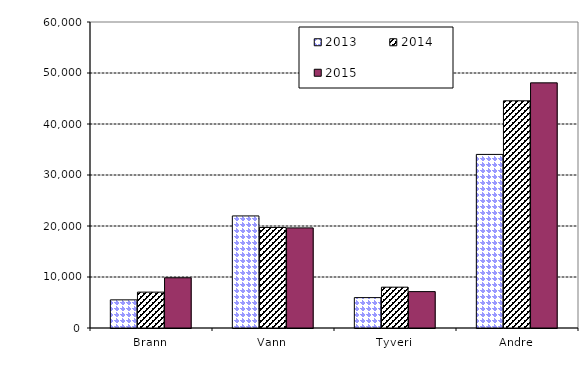
| Category | 2013 | 2014 | 2015 |
|---|---|---|---|
| Brann | 5520.445 | 7032 | 9848 |
| Vann | 21974.572 | 19713 | 19630 |
| Tyveri | 5958.397 | 8004 | 7135 |
| Andre | 34036.539 | 44550 | 48068 |